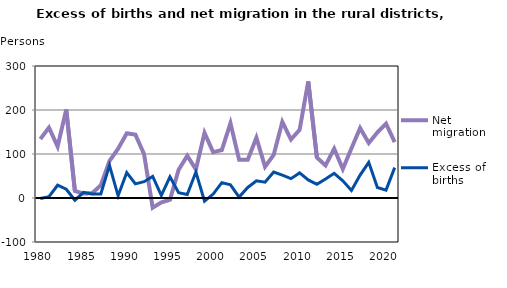
| Category | Net migration | Excess of births |
|---|---|---|
| 1980.0 | 134 | -1 |
| 1981.0 | 160 | 3 |
| 1982.0 | 117 | 29 |
| 1983.0 | 201 | 20 |
| 1984.0 | 16 | -5 |
| 1985.0 | 10 | 13 |
| 1986.0 | 11 | 9 |
| 1987.0 | 29 | 9 |
| 1988.0 | 84 | 74 |
| 1989.0 | 112 | 5 |
| 1990.0 | 147 | 58 |
| 1991.0 | 144 | 32 |
| 1992.0 | 100 | 37 |
| 1993.0 | -22 | 49 |
| 1994.0 | -10 | 6 |
| 1995.0 | -4 | 48 |
| 1996.0 | 64 | 12 |
| 1997.0 | 96 | 8 |
| 1998.0 | 65 | 59 |
| 1999.0 | 148 | -7 |
| 2000.0 | 104 | 9 |
| 2001.0 | 109 | 35 |
| 2002.0 | 170 | 30 |
| 2003.0 | 87 | 2 |
| 2004.0 | 87 | 24 |
| 2005.0 | 137 | 39 |
| 2006.0 | 71 | 36 |
| 2007.0 | 98 | 59 |
| 2008.0 | 173 | 52 |
| 2009.0 | 133 | 44 |
| 2010.0 | 155 | 57 |
| 2011.0 | 265 | 41 |
| 2012.0 | 92 | 31 |
| 2013.0 | 74 | 43 |
| 2014.0 | 112 | 56 |
| 2015.0 | 66 | 39 |
| 2016.0 | 113 | 17 |
| 2017.0 | 159 | 52 |
| 2018.0 | 125 | 81 |
| 2019.0 | 149 | 24 |
| 2020.0 | 169 | 18 |
| 2021.0 | 127 | 69 |